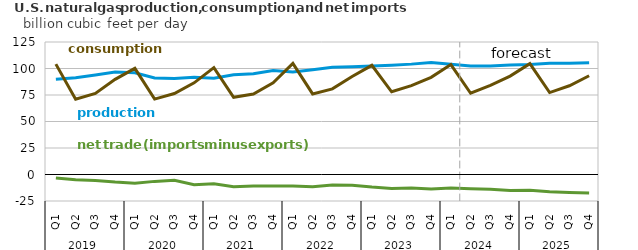
| Category | World production | World consumption | net imports |
|---|---|---|---|
| 2019-Q1 | 89.794 | 104.125 | -3.234 |
| 2019-Q2 | 91.257 | 71.052 | -4.963 |
| 2019-Q3 | 93.764 | 76.457 | -5.588 |
| 2019-Q4 | 96.596 | 89.794 | -7.164 |
| 2020-Q1 | 96.052 | 100.165 | -8.225 |
| 2020-Q2 | 91.062 | 71.148 | -6.491 |
| 2020-Q3 | 90.67 | 76.408 | -5.531 |
| 2020-Q4 | 91.763 | 86.47 | -9.625 |
| 2021-Q1 | 90.822 | 100.789 | -8.758 |
| 2021-Q2 | 94.124 | 72.858 | -11.653 |
| 2021-Q3 | 95.157 | 76.001 | -10.829 |
| 2021-Q4 | 98.212 | 86.44 | -10.866 |
| 2022-Q1 | 96.628 | 104.811 | -10.918 |
| 2022-Q2 | 98.924 | 76.028 | -11.572 |
| 2022-Q3 | 101.198 | 80.762 | -9.971 |
| 2022-Q4 | 101.567 | 92.462 | -10.074 |
| 2023-Q1 | 102.264 | 102.991 | -11.839 |
| 2023-Q2 | 103.158 | 78.04 | -13.168 |
| 2023-Q3 | 104.125 | 83.868 | -12.631 |
| 2023-Q4 | 105.566 | 91.668 | -13.652 |
| 2024-Q1 | 104.006 | 103.736 | -12.849 |
| 2024-Q2 | 102.274 | 76.657 | -13.438 |
| 2024-Q3 | 102.38 | 84.08 | -13.885 |
| 2024-Q4 | 103.313 | 92.804 | -15.196 |
| 2025-Q1 | 103.845 | 104.573 | -14.862 |
| 2025-Q2 | 104.887 | 77.317 | -16.333 |
| 2025-Q3 | 104.966 | 83.719 | -16.969 |
| 2025-Q4 | 105.46 | 93.132 | -17.363 |